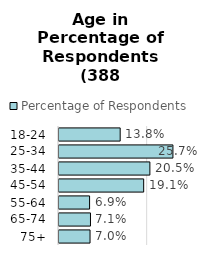
| Category | Percentage of Respondents |
|---|---|
| 75+ | 0.07 |
| 65-74 | 0.071 |
| 55-64 | 0.069 |
| 45-54 | 0.191 |
| 35-44 | 0.205 |
| 25-34 | 0.257 |
| 18-24 | 0.138 |